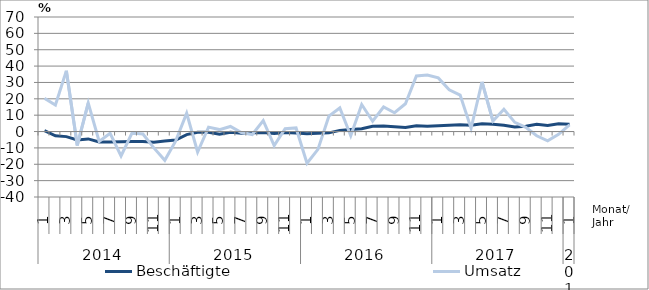
| Category | Beschäftigte | Umsatz |
|---|---|---|
| 0 | 0.5 | 20.3 |
| 1 | -2.6 | 16.2 |
| 2 | -3.1 | 37.1 |
| 3 | -5.1 | -8.5 |
| 4 | -4.5 | 17.4 |
| 5 | -6.4 | -6.1 |
| 6 | -6.4 | -1.1 |
| 7 | -6.2 | -14.9 |
| 8 | -6.1 | -0.9 |
| 9 | -6.1 | -1.5 |
| 10 | -6.6 | -10 |
| 11 | -5.8 | -17.6 |
| 12 | -5.2 | -5.7 |
| 13 | -1.9 | 11.2 |
| 14 | -0.5 | -12.5 |
| 15 | -0.5 | 2.7 |
| 16 | -1.7 | 1.2 |
| 17 | -0.5 | 3.1 |
| 18 | -1.1 | -0.6 |
| 19 | -0.8 | -1.8 |
| 20 | -0.6 | 6.7 |
| 21 | -1.2 | -8.6 |
| 22 | -0.6 | 1.7 |
| 23 | -0.9 | 2.2 |
| 24 | -1.3 | -19.4 |
| 25 | -1.1 | -10.9 |
| 26 | -0.8 | 9.4 |
| 27 | 0.7 | 14.4 |
| 28 | 1.2 | -2.6 |
| 29 | 1.7 | 16.5 |
| 30 | 3.2 | 6.3 |
| 31 | 3.4 | 15 |
| 32 | 3 | 11.5 |
| 33 | 2.5 | 17 |
| 34 | 3.6 | 34 |
| 35 | 3.2 | 34.6 |
| 36 | 3.5 | 32.8 |
| 37 | 3.8 | 25.5 |
| 38 | 4.2 | 22.3 |
| 39 | 3.9 | 2 |
| 40 | 4.7 | 30.3 |
| 41 | 4.4 | 6.4 |
| 42 | 3.9 | 13.6 |
| 43 | 2.8 | 5.6 |
| 44 | 3.3 | 2.6 |
| 45 | 4.4 | -2.6 |
| 46 | 3.7 | -5.7 |
| 47 | 4.7 | -1.7 |
| 48 | 4.4 | 4.1 |